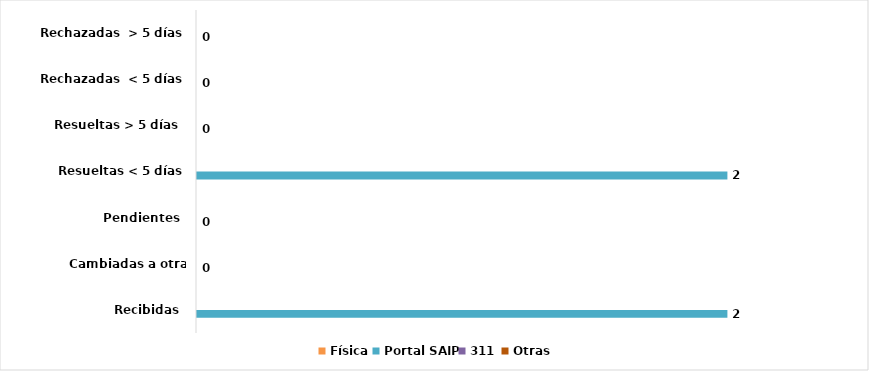
| Category | Física | Portal SAIP | 311 | Otras |
|---|---|---|---|---|
| Recibidas  | 0 | 2 | 0 | 0 |
| Cambiadas a otra Institución | 0 | 0 | 0 | 0 |
| Pendientes  | 0 | 0 | 0 | 0 |
| Resueltas < 5 días | 0 | 2 | 0 | 0 |
| Resueltas > 5 días  | 0 | 0 | 0 | 0 |
| Rechazadas  < 5 días | 0 | 0 | 0 | 0 |
| Rechazadas  > 5 días | 0 | 0 | 0 | 0 |